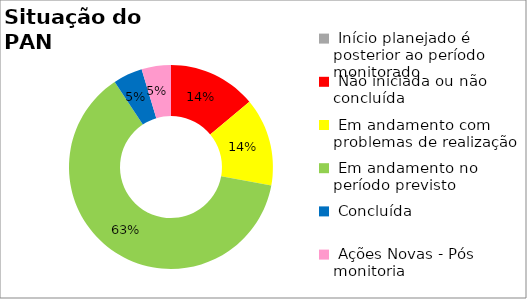
| Category | Series 0 |
|---|---|
|  Início planejado é posterior ao período monitorado | 0 |
|  Não iniciada ou não concluída | 0.14 |
|  Em andamento com problemas de realização | 0.14 |
|  Em andamento no período previsto  | 0.628 |
|  Concluída | 0.047 |
|  Ações Novas - Pós monitoria | 0.047 |